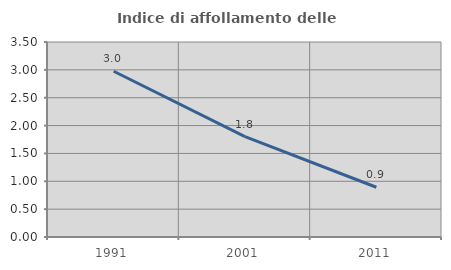
| Category | Indice di affollamento delle abitazioni  |
|---|---|
| 1991.0 | 2.975 |
| 2001.0 | 1.802 |
| 2011.0 | 0.893 |